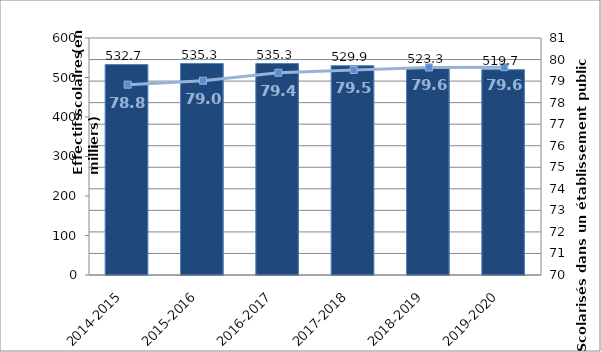
| Category | Effectifs scolaires 
(en milliers) |
|---|---|
| 2014-2015 | 532.682 |
| 2015-2016 | 535.333 |
| 2016-2017 | 535.33 |
| 2017-2018 | 529.867 |
| 2018-2019 | 523.28 |
| 2019-2020 | 519.693 |